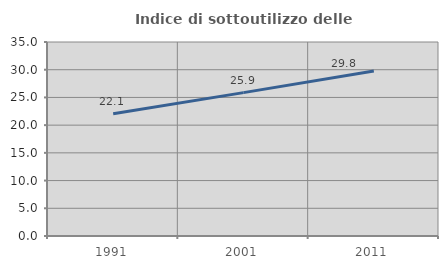
| Category | Indice di sottoutilizzo delle abitazioni  |
|---|---|
| 1991.0 | 22.056 |
| 2001.0 | 25.865 |
| 2011.0 | 29.784 |